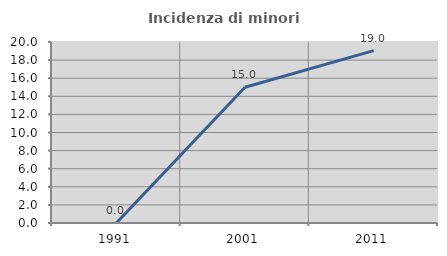
| Category | Incidenza di minori stranieri |
|---|---|
| 1991.0 | 0 |
| 2001.0 | 15 |
| 2011.0 | 19.048 |